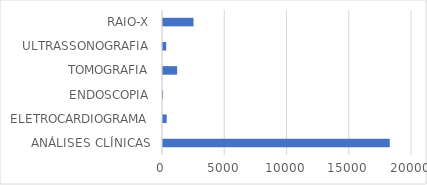
| Category | Series 0 |
|---|---|
| ANÁLISES CLÍNICAS | 18212 |
| ELETROCARDIOGRAMA | 298 |
| ENDOSCOPIA | 5 |
| TOMOGRAFIA | 1136 |
| ULTRASSONOGRAFIA | 257 |
| RAIO-X | 2452 |